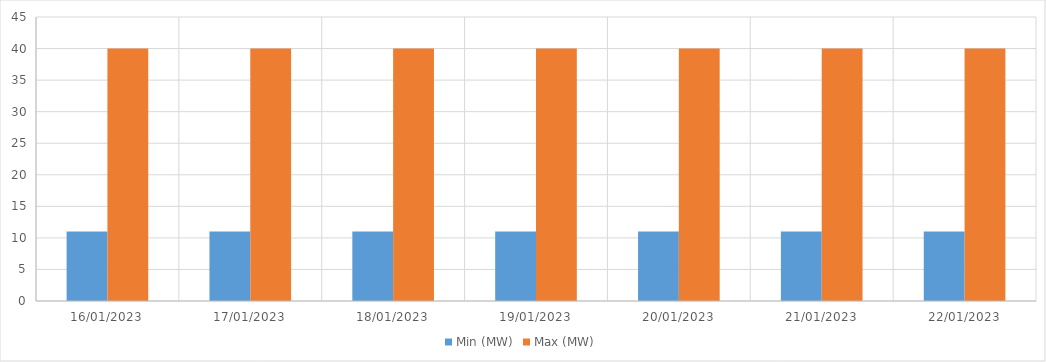
| Category | Min (MW) | Max (MW) |
|---|---|---|
| 16/01/2023 | 11 | 40 |
| 17/01/2023 | 11 | 40 |
| 18/01/2023 | 11 | 40 |
| 19/01/2023 | 11 | 40 |
| 20/01/2023 | 11 | 40 |
| 21/01/2023 | 11 | 40 |
| 22/01/2023 | 11 | 40 |